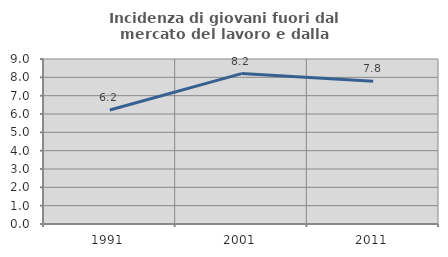
| Category | Incidenza di giovani fuori dal mercato del lavoro e dalla formazione  |
|---|---|
| 1991.0 | 6.215 |
| 2001.0 | 8.203 |
| 2011.0 | 7.784 |